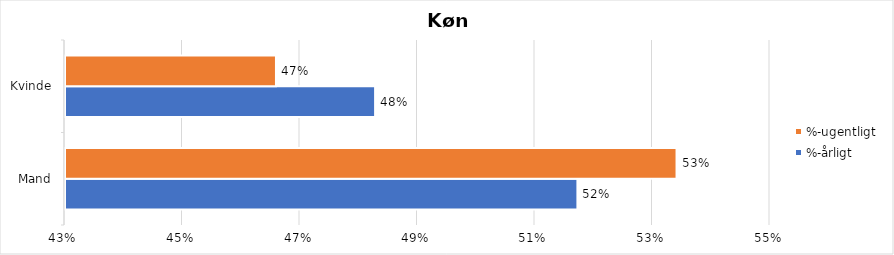
| Category | %-årligt | %-ugentligt |
|---|---|---|
| Mand | 0.517 | 0.534 |
| Kvinde | 0.483 | 0.466 |